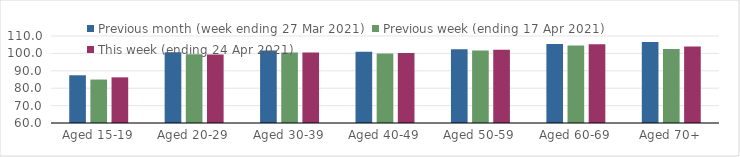
| Category | Previous month (week ending 27 Mar 2021) | Previous week (ending 17 Apr 2021) | This week (ending 24 Apr 2021) |
|---|---|---|---|
| Aged 15-19 | 87.43 | 84.98 | 86.24 |
| Aged 20-29 | 100.59 | 99.49 | 99.37 |
| Aged 30-39 | 101.72 | 100.47 | 100.54 |
| Aged 40-49 | 101.01 | 99.92 | 100.27 |
| Aged 50-59 | 102.44 | 101.63 | 102.15 |
| Aged 60-69 | 105.4 | 104.58 | 105.19 |
| Aged 70+ | 106.6 | 102.6 | 104.02 |